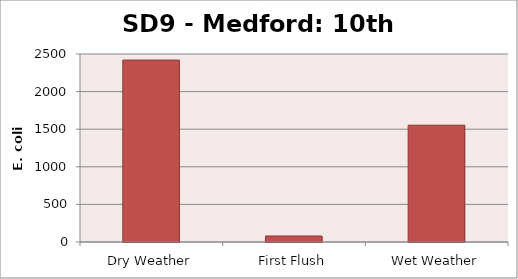
| Category | E. coli MPN |
|---|---|
| Dry Weather | 2419.2 |
| First Flush | 79.8 |
| Wet Weather | 1553.1 |